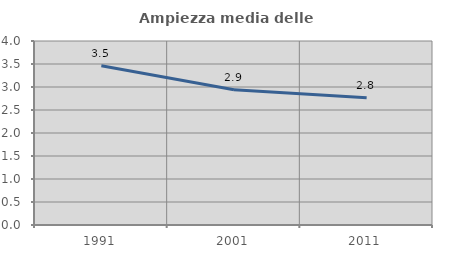
| Category | Ampiezza media delle famiglie |
|---|---|
| 1991.0 | 3.462 |
| 2001.0 | 2.94 |
| 2011.0 | 2.765 |